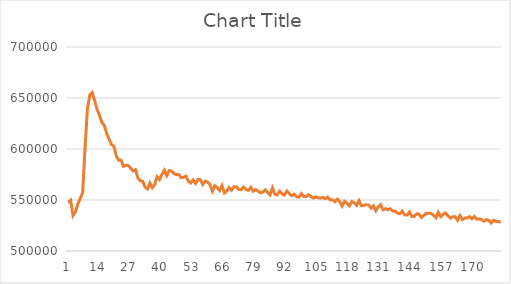
| Category | Series 0 |
|---|---|
| 0 | 547612.095 |
| 1 | 549683.189 |
| 2 | 534767.867 |
| 3 | 538258.094 |
| 4 | 546079.371 |
| 5 | 551626.058 |
| 6 | 557010.891 |
| 7 | 600629.456 |
| 8 | 639604.645 |
| 9 | 652930.229 |
| 10 | 655437.401 |
| 11 | 647302.19 |
| 12 | 638945.137 |
| 13 | 633132.854 |
| 14 | 625965.43 |
| 15 | 623282.17 |
| 16 | 615357.619 |
| 17 | 609684.574 |
| 18 | 604351.992 |
| 19 | 602845.838 |
| 20 | 593135.738 |
| 21 | 589065.74 |
| 22 | 589093.478 |
| 23 | 582950.303 |
| 24 | 584043.392 |
| 25 | 583908.361 |
| 26 | 581275.766 |
| 27 | 578409.35 |
| 28 | 579675.265 |
| 29 | 571572.008 |
| 30 | 568877.833 |
| 31 | 568288.051 |
| 32 | 562597.743 |
| 33 | 560786.978 |
| 34 | 566551.694 |
| 35 | 562064.106 |
| 36 | 565117.571 |
| 37 | 572698.738 |
| 38 | 570031.037 |
| 39 | 575016.158 |
| 40 | 579237.396 |
| 41 | 573877.693 |
| 42 | 578750.903 |
| 43 | 578481.575 |
| 44 | 575880.181 |
| 45 | 574873.146 |
| 46 | 574993.771 |
| 47 | 571843.866 |
| 48 | 572244.97 |
| 49 | 573383.503 |
| 50 | 568453.929 |
| 51 | 566591.43 |
| 52 | 569639.086 |
| 53 | 566375.599 |
| 54 | 570180.707 |
| 55 | 569903.34 |
| 56 | 565262.53 |
| 57 | 568518.908 |
| 58 | 567648.28 |
| 59 | 565314.193 |
| 60 | 558693.616 |
| 61 | 563956.766 |
| 62 | 562255.919 |
| 63 | 559258.633 |
| 64 | 564170.505 |
| 65 | 556923.398 |
| 66 | 558877.927 |
| 67 | 562148.398 |
| 68 | 559652.904 |
| 69 | 563112.941 |
| 70 | 562780.903 |
| 71 | 560481.643 |
| 72 | 560085.986 |
| 73 | 562673.759 |
| 74 | 560143.191 |
| 75 | 559535.663 |
| 76 | 562396.097 |
| 77 | 558572.209 |
| 78 | 560272.16 |
| 79 | 558624.391 |
| 80 | 557114.709 |
| 81 | 557732.936 |
| 82 | 559987.412 |
| 83 | 557121.827 |
| 84 | 554927.582 |
| 85 | 561941.523 |
| 86 | 555729.824 |
| 87 | 555035.239 |
| 88 | 558663.498 |
| 89 | 556000.624 |
| 90 | 554900.607 |
| 91 | 558852.71 |
| 92 | 556283.303 |
| 93 | 554166.188 |
| 94 | 555668.185 |
| 95 | 553294.686 |
| 96 | 552768.061 |
| 97 | 556280.184 |
| 98 | 553330.881 |
| 99 | 553435.594 |
| 100 | 555189.677 |
| 101 | 553294.788 |
| 102 | 551900.124 |
| 103 | 553108.62 |
| 104 | 552170.94 |
| 105 | 551794.101 |
| 106 | 552548.352 |
| 107 | 551251.714 |
| 108 | 552784.602 |
| 109 | 550075.822 |
| 110 | 550287.795 |
| 111 | 548350.801 |
| 112 | 550864.613 |
| 113 | 548334.726 |
| 114 | 544105.134 |
| 115 | 548776.075 |
| 116 | 547015.29 |
| 117 | 544123.549 |
| 118 | 548487.288 |
| 119 | 547276.809 |
| 120 | 544863.902 |
| 121 | 549383.473 |
| 122 | 544361.838 |
| 123 | 544706.35 |
| 124 | 545383.378 |
| 125 | 545115.39 |
| 126 | 542081.15 |
| 127 | 544248.25 |
| 128 | 539423.243 |
| 129 | 543097.258 |
| 130 | 545498.564 |
| 131 | 540429.151 |
| 132 | 541498.702 |
| 133 | 540576.214 |
| 134 | 541353.632 |
| 135 | 539304.748 |
| 136 | 539110.523 |
| 137 | 537211.632 |
| 138 | 536515.13 |
| 139 | 539067.048 |
| 140 | 535426.785 |
| 141 | 535244.8 |
| 142 | 538211.9 |
| 143 | 533889.128 |
| 144 | 533919.748 |
| 145 | 536522.252 |
| 146 | 536119.243 |
| 147 | 532948.717 |
| 148 | 534906.661 |
| 149 | 536951.814 |
| 150 | 537081.535 |
| 151 | 536732.961 |
| 152 | 535030.064 |
| 153 | 532604.57 |
| 154 | 537853.764 |
| 155 | 533716.779 |
| 156 | 535823.603 |
| 157 | 537324.405 |
| 158 | 534502.654 |
| 159 | 532259.258 |
| 160 | 533572.686 |
| 161 | 533542.95 |
| 162 | 530163.311 |
| 163 | 534728.457 |
| 164 | 530694.926 |
| 165 | 532201.239 |
| 166 | 532498.811 |
| 167 | 533707.591 |
| 168 | 531550.389 |
| 169 | 533904.875 |
| 170 | 531268.244 |
| 171 | 531492.537 |
| 172 | 530841.396 |
| 173 | 529272.423 |
| 174 | 530621.957 |
| 175 | 530091.379 |
| 176 | 527397.841 |
| 177 | 530182.705 |
| 178 | 529012.59 |
| 179 | 528800.486 |
| 180 | 528390.903 |